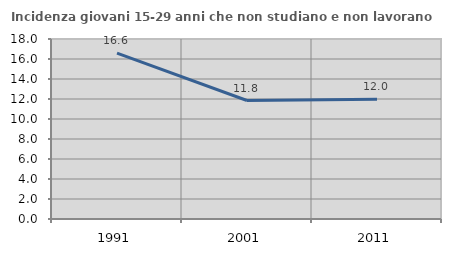
| Category | Incidenza giovani 15-29 anni che non studiano e non lavorano  |
|---|---|
| 1991.0 | 16.589 |
| 2001.0 | 11.847 |
| 2011.0 | 11.98 |